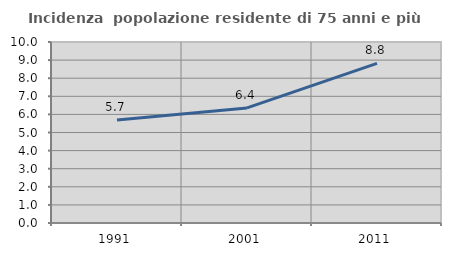
| Category | Incidenza  popolazione residente di 75 anni e più |
|---|---|
| 1991.0 | 5.689 |
| 2001.0 | 6.357 |
| 2011.0 | 8.824 |